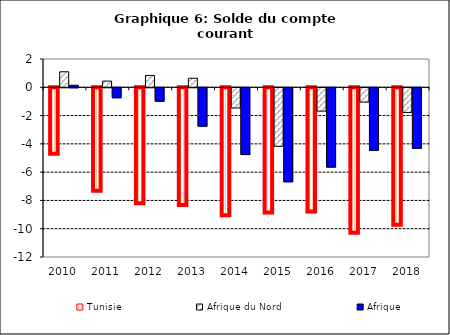
| Category | Tunisie | Afrique du Nord | Afrique |
|---|---|---|---|
| 2010.0 | -4.777 | 1.095 | 0.144 |
| 2011.0 | -7.391 | 0.439 | -0.706 |
| 2012.0 | -8.262 | 0.839 | -0.95 |
| 2013.0 | -8.386 | 0.638 | -2.715 |
| 2014.0 | -9.113 | -1.429 | -4.722 |
| 2015.0 | -8.921 | -4.138 | -6.65 |
| 2016.0 | -8.857 | -1.65 | -5.608 |
| 2017.0 | -10.355 | -1.011 | -4.418 |
| 2018.0 | -9.785 | -1.744 | -4.278 |